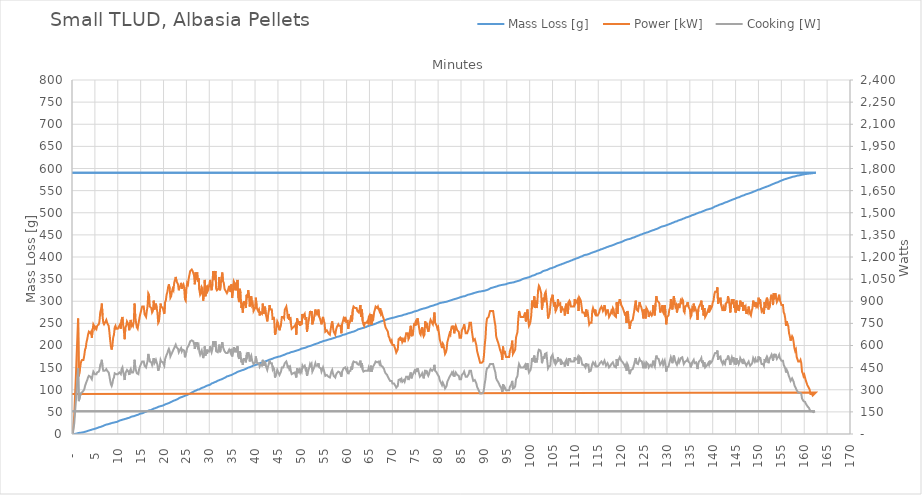
| Category | Mass Loss [g] |
|---|---|
| 0.1666666637174785 | 0 |
| 0.333333337912336 | 0 |
| 0.5000000016298145 | 0.1 |
| 0.666666665347293 | 0.3 |
| 0.849999999627471 | 0.6 |
| 1.000000003259629 | 1 |
| 1.1666666669771075 | 1.5 |
| 1.333333330694586 | 2.1 |
| 1.5000000048894435 | 2.4 |
| 1.666666668606922 | 2.7 |
| 1.8500000028871 | 2.8 |
| 2.0166666666045785 | 3.1 |
| 2.183333330322057 | 3.4 |
| 2.333333333954215 | 3.7 |
| 2.4999999976716936 | 4 |
| 2.6833333319518715 | 4.5 |
| 2.84999999566935 | 5 |
| 2.999999999301508 | 5.5 |
| 3.1666666630189866 | 6 |
| 3.333333337213844 | 6.5 |
| 3.5000000009313226 | 7.1 |
| 3.6833333352115005 | 7.7 |
| 3.849999998928979 | 8.4 |
| 4.000000002561137 | 8.6 |
| 4.166666666278616 | 9.3 |
| 4.333333329996094 | 9.8 |
| 4.500000004190952 | 10.4 |
| 4.66666666790843 | 10.9 |
| 4.833333331625909 | 11.4 |
| 4.999999995343387 | 11.8 |
| 5.166666669538245 | 12.4 |
| 5.350000003818423 | 12.5 |
| 5.499999996973202 | 13.5 |
| 5.666666671168059 | 14.5 |
| 5.849999994970858 | 15 |
| 5.999999998603016 | 15.5 |
| 6.166666662320495 | 15.8 |
| 6.333333336515352 | 16.4 |
| 6.51666667079553 | 17.1 |
| 6.666666663950309 | 17.7 |
| 6.833333338145167 | 18.3 |
| 7.000000001862645 | 19 |
| 7.166666665580124 | 20 |
| 7.349999999860302 | 20.8 |
| 7.50000000349246 | 21.3 |
| 7.683333337772638 | 21.5 |
| 7.833333330927417 | 22 |
| 8.016666665207595 | 22.4 |
| 8.166666668839753 | 23 |
| 8.35000000311993 | 23.4 |
| 8.49999999627471 | 24.1 |
| 8.666666670469567 | 24.6 |
| 8.833333334187046 | 25.1 |
| 8.999999997904524 | 25.6 |
| 9.166666661622003 | 25.9 |
| 9.33333333581686 | 26.3 |
| 9.499999999534339 | 26.7 |
| 9.683333333814517 | 27 |
| 9.833333337446675 | 27.5 |
| 10.000000001164153 | 28.5 |
| 10.166666664881632 | 29.1 |
| 10.33333332859911 | 30.2 |
| 10.500000002793968 | 30.7 |
| 10.666666666511446 | 31.2 |
| 10.833333330228925 | 31.7 |
| 11.016666664509103 | 32.2 |
| 11.16666666814126 | 32.7 |
| 11.33333333185874 | 33.2 |
| 11.499999995576218 | 33.7 |
| 11.666666669771075 | 33.8 |
| 11.850000004051253 | 34.7 |
| 12.016666667768732 | 35.4 |
| 12.18333333148621 | 35.9 |
| 12.333333335118368 | 36.1 |
| 12.516666669398546 | 36.6 |
| 12.666666662553325 | 37.9 |
| 12.833333336748183 | 38.5 |
| 13.000000000465661 | 39.3 |
| 13.16666666418314 | 39.7 |
| 13.333333338377997 | 40.1 |
| 13.500000002095476 | 40.2 |
| 13.666666665812954 | 41.2 |
| 13.833333329530433 | 41.5 |
| 14.00000000372529 | 42 |
| 14.166666667442769 | 42.8 |
| 14.350000001722947 | 43.2 |
| 14.500000005355105 | 43.7 |
| 14.666666669072583 | 45.4 |
| 14.850000003352761 | 45.8 |
| 14.99999999650754 | 46 |
| 15.166666670702398 | 46.5 |
| 15.333333334419876 | 46.8 |
| 15.499999998137355 | 47.2 |
| 15.683333332417533 | 47.9 |
| 15.849999996135011 | 49.2 |
| 15.99999999976717 | 49.7 |
| 16.183333334047347 | 50.4 |
| 16.349999997764826 | 51.4 |
| 16.500000001396984 | 51.8 |
| 16.666666665114462 | 52.3 |
| 16.83333332883194 | 53.5 |
| 17.0000000030268 | 53.8 |
| 17.166666666744277 | 53.9 |
| 17.333333330461755 | 54.8 |
| 17.500000004656613 | 55.4 |
| 17.66666666837409 | 56.7 |
| 17.85000000265427 | 57.3 |
| 17.99999999580905 | 57.8 |
| 18.183333330089226 | 58.3 |
| 18.333333333721384 | 58.9 |
| 18.499999997438863 | 59.6 |
| 18.66666667163372 | 60.1 |
| 18.8333333353512 | 61.3 |
| 18.999999999068677 | 61.9 |
| 19.166666662786156 | 62.4 |
| 19.349999997066334 | 62.7 |
| 19.500000000698492 | 63.3 |
| 19.68333333497867 | 63.6 |
| 19.84999999869615 | 64.2 |
| 20.000000002328306 | 64.9 |
| 20.166666666045785 | 65.9 |
| 20.350000000325963 | 67.1 |
| 20.50000000395812 | 67.5 |
| 20.6666666676756 | 68.2 |
| 20.850000001955777 | 68.6 |
| 20.999999995110556 | 69.6 |
| 21.166666669305414 | 70 |
| 21.350000003585592 | 71.3 |
| 21.49999999674037 | 71.7 |
| 21.66666667093523 | 72.7 |
| 21.833333334652707 | 73.2 |
| 21.999999998370185 | 74.1 |
| 22.166666662087664 | 75 |
| 22.33333333628252 | 75.7 |
| 22.5 | 76.3 |
| 22.66666666371748 | 76.8 |
| 22.849999997997656 | 77.8 |
| 23.000000001629815 | 78.4 |
| 23.166666665347293 | 79.3 |
| 23.33333332906477 | 80.2 |
| 23.50000000325963 | 81.7 |
| 23.683333337539807 | 82.3 |
| 23.833333330694586 | 83 |
| 24.000000004889444 | 83.5 |
| 24.166666668606922 | 84.2 |
| 24.3500000028871 | 84.7 |
| 24.49999999604188 | 85.6 |
| 24.683333330322057 | 86.3 |
| 24.850000004516914 | 87 |
| 24.999999997671694 | 87.6 |
| 25.16666667186655 | 88.4 |
| 25.34999999566935 | 89.4 |
| 25.499999999301508 | 90.1 |
| 25.666666663018987 | 90.8 |
| 25.833333337213844 | 91.3 |
| 26.000000000931323 | 92.8 |
| 26.1666666646488 | 93.7 |
| 26.34999999892898 | 94.3 |
| 26.500000002561137 | 95.2 |
| 26.666666666278616 | 96.1 |
| 26.833333329996094 | 97.3 |
| 27.00000000419095 | 98 |
| 27.18333333847113 | 98.7 |
| 27.350000002188608 | 99.4 |
| 27.499999995343387 | 100.4 |
| 27.666666669538245 | 100.8 |
| 27.850000003818423 | 100.9 |
| 27.9999999969732 | 102.2 |
| 28.16666667116806 | 103.2 |
| 28.349999994970858 | 104.6 |
| 28.499999998603016 | 104.6 |
| 28.666666662320495 | 105.7 |
| 28.849999996600673 | 105.8 |
| 29.00000000023283 | 106.7 |
| 29.16666666395031 | 107.5 |
| 29.333333338145167 | 108.6 |
| 29.500000001862645 | 109.2 |
| 29.666666665580124 | 109.4 |
| 29.833333329297602 | 110.3 |
| 30.00000000349246 | 111.3 |
| 30.183333337772638 | 111.5 |
| 30.333333330927417 | 113.2 |
| 30.500000005122274 | 114.1 |
| 30.683333328925073 | 114.5 |
| 30.85000000311993 | 115.5 |
| 30.99999999627471 | 115.6 |
| 31.183333330554888 | 117.1 |
| 31.350000004749745 | 117.5 |
| 31.499999997904524 | 118.3 |
| 31.666666661622003 | 119.3 |
| 31.84999999590218 | 120.4 |
| 31.99999999953434 | 120.7 |
| 32.16666666325182 | 121.7 |
| 32.349999997531995 | 122.5 |
| 32.50000000116415 | 123 |
| 32.68333333544433 | 123.8 |
| 32.83333332859911 | 124.2 |
| 33.00000000279397 | 125.3 |
| 33.166666666511446 | 126.2 |
| 33.333333330228925 | 126.8 |
| 33.50000000442378 | 127.6 |
| 33.66666666814126 | 128.4 |
| 33.85000000242144 | 130.2 |
| 33.99999999557622 | 130.7 |
| 34.166666669771075 | 130.9 |
| 34.35000000405125 | 131.5 |
| 34.49999999720603 | 132.3 |
| 34.66666667140089 | 132.6 |
| 34.83333333511837 | 133.3 |
| 34.99999999883585 | 133.8 |
| 35.166666662553325 | 135.1 |
| 35.3499999968335 | 136.2 |
| 35.50000000046566 | 136.8 |
| 35.68333333474584 | 137.2 |
| 35.84999999846332 | 138.5 |
| 36.000000002095476 | 139.4 |
| 36.166666665812954 | 140.4 |
| 36.33333332953043 | 141.2 |
| 36.50000000372529 | 141.7 |
| 36.66666666744277 | 142 |
| 36.83333333116025 | 142.8 |
| 37.000000005355105 | 143 |
| 37.183333329157904 | 144.2 |
| 37.33333333279006 | 144.3 |
| 37.49999999650754 | 145.1 |
| 37.68333333078772 | 146.6 |
| 37.850000004982576 | 146.7 |
| 37.999999998137355 | 147 |
| 38.16666666185483 | 148.2 |
| 38.34999999613501 | 148.6 |
| 38.49999999976717 | 150.1 |
| 38.68333333404735 | 150.6 |
| 38.833333337679505 | 150.9 |
| 39.000000001396984 | 151.3 |
| 39.16666666511446 | 152.4 |
| 39.34999999939464 | 153.4 |
| 39.5000000030268 | 154 |
| 39.66666666674428 | 154.4 |
| 39.833333330461755 | 155.2 |
| 40.00000000465661 | 155.8 |
| 40.16666666837409 | 156.3 |
| 40.35000000265427 | 156.9 |
| 40.49999999580905 | 157.4 |
| 40.666666670003906 | 158.4 |
| 40.850000004284084 | 158.9 |
| 40.99999999743886 | 159.4 |
| 41.16666667163372 | 160.5 |
| 41.34999999543652 | 161 |
| 41.49999999906868 | 161.8 |
| 41.683333333348855 | 162.3 |
| 41.849999997066334 | 162.8 |
| 42.00000000069849 | 163.2 |
| 42.16666666441597 | 164 |
| 42.34999999869615 | 164.5 |
| 42.500000002328306 | 165 |
| 42.666666666045785 | 166.2 |
| 42.83333332976326 | 166.5 |
| 43.00000000395812 | 167.2 |
| 43.1666666676756 | 168 |
| 43.33333333139308 | 168.6 |
| 43.49999999511056 | 169.1 |
| 43.666666669305414 | 169.4 |
| 43.85000000358559 | 170.3 |
| 43.99999999674037 | 171.1 |
| 44.18333333102055 | 171.9 |
| 44.350000005215406 | 172.4 |
| 44.499999998370185 | 172.9 |
| 44.666666662087664 | 173.4 |
| 44.84999999636784 | 173.9 |
| 45.0 | 174.4 |
| 45.16666666371748 | 174.9 |
| 45.333333337912336 | 174.7 |
| 45.500000001629815 | 175.4 |
| 45.66666666534729 | 176.3 |
| 45.84999999962747 | 177 |
| 46.00000000325963 | 177.8 |
| 46.16666666697711 | 178.3 |
| 46.350000001257285 | 178.9 |
| 46.50000000488944 | 179.4 |
| 46.68333332869224 | 180.3 |
| 46.8333333323244 | 181.3 |
| 46.99999999604188 | 181.8 |
| 47.16666667023674 | 182.3 |
| 47.350000004516914 | 182.7 |
| 47.499999997671694 | 183.1 |
| 47.68333333195187 | 183.9 |
| 47.84999999566935 | 184.9 |
| 47.99999999930151 | 185.3 |
| 48.16666666301899 | 185.6 |
| 48.333333337213844 | 186.4 |
| 48.50000000093132 | 186.6 |
| 48.6833333352115 | 187.3 |
| 48.84999999892898 | 187.7 |
| 49.01666666264646 | 188.4 |
| 49.183333336841315 | 188.9 |
| 49.35000000055879 | 189.5 |
| 49.51666666427627 | 189.9 |
| 49.68333333847113 | 190.4 |
| 49.85000000218861 | 191.3 |
| 50.01666666590609 | 191.6 |
| 50.183333329623565 | 193.1 |
| 50.35000000381842 | 193.4 |
| 50.5166666675359 | 193.8 |
| 50.68333333125338 | 194.2 |
| 50.84999999497086 | 194.6 |
| 51.016666669165716 | 195.3 |
| 51.183333332883194 | 195.8 |
| 51.34999999660067 | 197 |
| 51.51666667079553 | 197.4 |
| 51.68333333451301 | 197.8 |
| 51.84999999823049 | 198.5 |
| 52.016666661947966 | 199 |
| 52.18333333614282 | 199.5 |
| 52.3499999998603 | 200 |
| 52.51666666357778 | 200.7 |
| 52.68333333777264 | 201.4 |
| 52.850000001490116 | 202.1 |
| 53.016666665207595 | 202.9 |
| 53.18333332892507 | 203.4 |
| 53.35000000311993 | 204.1 |
| 53.51666666683741 | 204.4 |
| 53.68333333055489 | 204.8 |
| 53.850000004749745 | 205.6 |
| 54.016666668467224 | 206.3 |
| 54.1833333321847 | 207.4 |
| 54.34999999590218 | 207.6 |
| 54.51666667009704 | 208.2 |
| 54.68333333381452 | 208.8 |
| 54.849999997531995 | 209.8 |
| 55.01666667172685 | 210 |
| 55.18333333544433 | 210.7 |
| 55.34999999916181 | 211.2 |
| 55.51666666287929 | 211.5 |
| 55.683333337074146 | 211.8 |
| 55.850000000791624 | 212.7 |
| 56.0166666645091 | 213.2 |
| 56.18333333870396 | 213.8 |
| 56.35000000242144 | 214.3 |
| 56.51666666613892 | 214.5 |
| 56.683333329856396 | 215.2 |
| 56.85000000405125 | 215.7 |
| 57.01666666776873 | 216.6 |
| 57.18333333148621 | 216.8 |
| 57.34999999520369 | 217.4 |
| 57.516666669398546 | 217.9 |
| 57.683333333116025 | 218.9 |
| 57.8499999968335 | 219.4 |
| 58.01666667102836 | 219.9 |
| 58.18333333474584 | 220.1 |
| 58.34999999846332 | 220.7 |
| 58.516666662180796 | 221 |
| 58.683333336375654 | 221.5 |
| 58.85000000009313 | 222.4 |
| 59.01666666381061 | 222.9 |
| 59.18333333800547 | 224 |
| 59.35000000172295 | 224.1 |
| 59.516666665440425 | 224.7 |
| 59.683333329157904 | 225.2 |
| 59.85000000335276 | 225.7 |
| 60.01666666707024 | 226.8 |
| 60.18333333078772 | 227.3 |
| 60.350000004982576 | 227.9 |
| 60.516666668700054 | 228.4 |
| 60.68333333241753 | 228.9 |
| 60.84999999613501 | 229.4 |
| 61.01666667032987 | 229.9 |
| 61.18333333404735 | 230.6 |
| 61.349999997764826 | 231.1 |
| 61.51666667195968 | 231.5 |
| 61.68333333567716 | 232.2 |
| 61.84999999939464 | 232.7 |
| 62.01666666311212 | 233.7 |
| 62.183333337306976 | 234.4 |
| 62.350000001024455 | 235.7 |
| 62.51666666474193 | 236.5 |
| 62.68333332845941 | 237 |
| 62.85000000265427 | 237.4 |
| 63.01666666637175 | 237.9 |
| 63.183333330089226 | 238.4 |
| 63.350000004284084 | 238.9 |
| 63.51666666800156 | 239.4 |
| 63.68333333171904 | 239.7 |
| 63.84999999543652 | 240.4 |
| 64.01666666963138 | 241.4 |
| 64.18333333334886 | 241.6 |
| 64.34999999706633 | 242.8 |
| 64.51666667126119 | 243.3 |
| 64.68333333497867 | 243.9 |
| 64.84999999869615 | 244.3 |
| 65.01666666241363 | 244.9 |
| 65.18333333660848 | 245.4 |
| 65.35000000032596 | 245.9 |
| 65.51666666404344 | 246.5 |
| 65.6833333382383 | 246.9 |
| 65.85000000195578 | 247.6 |
| 66.01666666567326 | 248.4 |
| 66.18333332939073 | 248.8 |
| 66.35000000358559 | 249.7 |
| 66.51666666730307 | 250.2 |
| 66.68333333102055 | 251.2 |
| 66.8500000052154 | 251.7 |
| 67.01666666893288 | 252.5 |
| 67.18333333265036 | 253.3 |
| 67.34999999636784 | 254 |
| 67.5166666705627 | 254.5 |
| 67.68333333428018 | 255 |
| 67.84999999799766 | 255.5 |
| 68.01666666171513 | 256.2 |
| 68.18333333590999 | 256.7 |
| 68.34999999962747 | 257.3 |
| 68.51666666334495 | 257.8 |
| 68.6833333375398 | 258.4 |
| 68.85000000125729 | 259.2 |
| 69.01666666497476 | 259.7 |
| 69.18333332869224 | 260.2 |
| 69.3500000028871 | 260.7 |
| 69.51666666660458 | 261.2 |
| 69.68333333032206 | 261.6 |
| 69.85000000451691 | 262 |
| 70.0166666682344 | 262.4 |
| 70.18333333195187 | 262.8 |
| 70.34999999566935 | 263.2 |
| 70.51666666986421 | 263.6 |
| 70.68333333358169 | 264 |
| 70.84999999729916 | 264.7 |
| 71.01666667149402 | 265.2 |
| 71.1833333352115 | 265.7 |
| 71.34999999892898 | 266.2 |
| 71.51666666264646 | 266.7 |
| 71.68333333684132 | 266.9 |
| 71.8500000005588 | 267.1 |
| 72.01666666427627 | 267.6 |
| 72.18333333847113 | 268.1 |
| 72.35000000218861 | 269.2 |
| 72.51666666590609 | 269.6 |
| 72.68333332962357 | 270.1 |
| 72.85000000381842 | 270.3 |
| 73.0166666675359 | 271.2 |
| 73.18333333125338 | 271.4 |
| 73.34999999497086 | 272 |
| 73.51666666916572 | 272.6 |
| 73.6833333328832 | 272.9 |
| 73.84999999660067 | 273.4 |
| 74.01666667079553 | 273.9 |
| 74.18333333451301 | 274.4 |
| 74.34999999823049 | 274.9 |
| 74.51666666194797 | 275.6 |
| 74.68333333614282 | 276.1 |
| 74.8499999998603 | 277.1 |
| 75.01666666357778 | 277.6 |
| 75.18333333777264 | 277.8 |
| 75.35000000149012 | 278.3 |
| 75.5166666652076 | 278.8 |
| 75.68333332892507 | 279.9 |
| 75.85000000311993 | 280.4 |
| 76.01666666683741 | 280.7 |
| 76.18333333055489 | 281.6 |
| 76.35000000474975 | 281.8 |
| 76.51666666846722 | 282.7 |
| 76.6833333321847 | 283.1 |
| 76.84999999590218 | 283.6 |
| 77.01666667009704 | 283.9 |
| 77.18333333381452 | 284.3 |
| 77.349999997532 | 284.8 |
| 77.51666667172685 | 285.5 |
| 77.68333333544433 | 286 |
| 77.84999999916181 | 286.5 |
| 78.01666666287929 | 287.1 |
| 78.18333333707415 | 288.3 |
| 78.35000000079162 | 288.8 |
| 78.5166666645091 | 289.3 |
| 78.68333333870396 | 289.8 |
| 78.85000000242144 | 290 |
| 79.01666666613892 | 290.7 |
| 79.1833333298564 | 291.4 |
| 79.35000000405125 | 292 |
| 79.51666666776873 | 292.5 |
| 79.68333333148621 | 293 |
| 79.84999999520369 | 293.4 |
| 80.01666666939855 | 294.2 |
| 80.18333333311602 | 295.3 |
| 80.3499999968335 | 295.8 |
| 80.51666667102836 | 296.3 |
| 80.68333333474584 | 296.6 |
| 80.84999999846332 | 296.9 |
| 81.0166666621808 | 297.2 |
| 81.18333333637565 | 297.5 |
| 81.35000000009313 | 297.8 |
| 81.51666666381061 | 298.4 |
| 81.68333333800547 | 298.5 |
| 81.85000000172295 | 298.8 |
| 82.01666666544043 | 299.5 |
| 82.1833333291579 | 300.2 |
| 82.35000000335276 | 301 |
| 82.51666666707024 | 301.2 |
| 82.68333333078772 | 301.8 |
| 82.85000000498258 | 302.3 |
| 83.01666666870005 | 303.1 |
| 83.18333333241753 | 303.6 |
| 83.34999999613501 | 304.1 |
| 83.51666667032987 | 304.6 |
| 83.68333333404735 | 305.1 |
| 83.84999999776483 | 305.6 |
| 84.01666667195968 | 306.1 |
| 84.18333333567716 | 306.6 |
| 84.34999999939464 | 307.5 |
| 84.51666666311212 | 307.8 |
| 84.68333333730698 | 308.3 |
| 84.85000000102445 | 309.1 |
| 85.01666666474193 | 309.6 |
| 85.18333332845941 | 310.1 |
| 85.35000000265427 | 310.6 |
| 85.51666666637175 | 311 |
| 85.68333333008923 | 311.1 |
| 85.85000000428408 | 311.6 |
| 86.01666666800156 | 312.1 |
| 86.18333333171904 | 313.1 |
| 86.34999999543652 | 313.6 |
| 86.51666666963138 | 314.7 |
| 86.68333333334886 | 315.2 |
| 86.84999999706633 | 315.4 |
| 87.01666667126119 | 315.9 |
| 87.18333333497867 | 316.4 |
| 87.34999999869615 | 316.9 |
| 87.51666666241363 | 317.4 |
| 87.68333333660848 | 318.1 |
| 87.85000000032596 | 318.6 |
| 88.01666666404344 | 319.1 |
| 88.1833333382383 | 319.6 |
| 88.35000000195578 | 320.1 |
| 88.51666666567326 | 320.6 |
| 88.68333332939073 | 321 |
| 88.85000000358559 | 321.5 |
| 89.01666666730307 | 321.8 |
| 89.18333333102055 | 322.1 |
| 89.3500000052154 | 322.4 |
| 89.51666666893288 | 322.5 |
| 89.68333333265036 | 322.8 |
| 89.84999999636784 | 323.3 |
| 90.0166666705627 | 323.6 |
| 90.18333333428018 | 323.9 |
| 90.34999999799766 | 324.4 |
| 90.51666666171513 | 324.9 |
| 90.68333333590999 | 325.4 |
| 90.84999999962747 | 325.9 |
| 91.01666666334495 | 326.8 |
| 91.1833333375398 | 327.8 |
| 91.35000000125729 | 328.6 |
| 91.51666666497476 | 329.8 |
| 91.68333332869224 | 330.3 |
| 91.8500000028871 | 330.6 |
| 92.01666666660458 | 331.2 |
| 92.18333333032206 | 331.7 |
| 92.35000000451691 | 332.2 |
| 92.5166666682344 | 332.7 |
| 92.68333333195187 | 333.2 |
| 92.84999999566935 | 333.7 |
| 93.01666666986421 | 334.2 |
| 93.18333333358169 | 335.1 |
| 93.34999999729916 | 335.4 |
| 93.51666667149402 | 335.9 |
| 93.6833333352115 | 336.4 |
| 93.84999999892898 | 336.7 |
| 94.01666666264646 | 337 |
| 94.18333333684132 | 337.3 |
| 94.3500000005588 | 337.6 |
| 94.51666666427627 | 337.9 |
| 94.68333333847113 | 338.4 |
| 94.85000000218861 | 338.6 |
| 95.01666666590609 | 338.7 |
| 95.18333332962357 | 340.1 |
| 95.35000000381842 | 340.5 |
| 95.5166666675359 | 341 |
| 95.68333333125338 | 341.3 |
| 95.84999999497086 | 341.6 |
| 96.01666666916572 | 341.9 |
| 96.1833333328832 | 342.2 |
| 96.34999999660067 | 342.5 |
| 96.51666667079553 | 342.8 |
| 96.68333333451301 | 343.5 |
| 96.84999999823049 | 344 |
| 97.01666666194797 | 344.5 |
| 97.18333333614282 | 345 |
| 97.3499999998603 | 345.5 |
| 97.51666666357778 | 346 |
| 97.68333333777264 | 346.5 |
| 97.85000000149012 | 347 |
| 98.0166666652076 | 348.1 |
| 98.18333332892507 | 348.6 |
| 98.35000000311993 | 349.1 |
| 98.51666666683741 | 350.3 |
| 98.68333333055489 | 351.1 |
| 98.85000000474975 | 351.6 |
| 99.01666666846722 | 351.9 |
| 99.1833333321847 | 352.4 |
| 99.34999999590218 | 352.9 |
| 99.51666667009704 | 353.4 |
| 99.68333333381452 | 353.9 |
| 99.849999997532 | 354.4 |
| 100.01666667172685 | 355.2 |
| 100.18333333544433 | 355.7 |
| 100.34999999916181 | 356.6 |
| 100.51666666287929 | 357.5 |
| 100.68333333707415 | 358 |
| 100.85000000079162 | 358.4 |
| 101.0166666645091 | 359 |
| 101.18333333870396 | 359.5 |
| 101.35000000242144 | 360.4 |
| 101.51666666613892 | 361.9 |
| 101.6833333298564 | 362 |
| 101.85000000405125 | 362.6 |
| 102.01666666776873 | 363.7 |
| 102.18333333148621 | 363.7 |
| 102.34999999520369 | 364.7 |
| 102.51666666939855 | 365.1 |
| 102.68333333311602 | 366.4 |
| 102.8499999968335 | 367.7 |
| 103.01666667102836 | 368.4 |
| 103.18333333474584 | 368.9 |
| 103.34999999846332 | 369.4 |
| 103.5166666621808 | 369.9 |
| 103.68333333637565 | 370.3 |
| 103.85000000009313 | 370.8 |
| 104.01666666381061 | 371.8 |
| 104.18333333800547 | 372.6 |
| 104.35000000172295 | 373.2 |
| 104.51666666544043 | 374.3 |
| 104.6833333291579 | 374.7 |
| 104.85000000335276 | 375 |
| 105.01666666707024 | 375.5 |
| 105.18333333078772 | 376.4 |
| 105.35000000498258 | 377 |
| 105.51666666870005 | 377.5 |
| 105.68333333241753 | 379 |
| 105.84999999613501 | 379.5 |
| 106.01666667032987 | 380.2 |
| 106.18333333404735 | 380.7 |
| 106.34999999776483 | 381.2 |
| 106.51666667195968 | 382.1 |
| 106.68333333567716 | 382.6 |
| 106.84999999939464 | 383.1 |
| 107.01666666311212 | 383.6 |
| 107.18333333730698 | 384.6 |
| 107.35000000102445 | 385.1 |
| 107.51666666474193 | 385.7 |
| 107.68333332845941 | 386.3 |
| 107.85000000265427 | 387.2 |
| 108.01666666637175 | 388.1 |
| 108.18333333008923 | 388.6 |
| 108.35000000428408 | 389.1 |
| 108.51666666800156 | 389.6 |
| 108.68333333171904 | 390.1 |
| 108.84999999543652 | 391.2 |
| 109.01666666963138 | 391.9 |
| 109.18333333334886 | 392.4 |
| 109.34999999706633 | 392.7 |
| 109.51666667126119 | 394 |
| 109.68333333497867 | 394.7 |
| 109.84999999869615 | 395.2 |
| 110.01666666241363 | 395.8 |
| 110.18333333660848 | 396.7 |
| 110.35000000032596 | 397.2 |
| 110.51666666404344 | 397.7 |
| 110.6833333382383 | 398.2 |
| 110.85000000195578 | 399.2 |
| 111.01666666567326 | 400 |
| 111.18333332939073 | 400.8 |
| 111.35000000358559 | 401.3 |
| 111.51666666730307 | 401.8 |
| 111.68333333102055 | 402.3 |
| 111.8500000052154 | 403.9 |
| 112.01666666893288 | 404.3 |
| 112.18333333265036 | 404.8 |
| 112.34999999636784 | 405.3 |
| 112.5166666705627 | 405.4 |
| 112.68333333428018 | 405.9 |
| 112.84999999799766 | 406.4 |
| 113.01666666171513 | 407.3 |
| 113.18333333590999 | 407.9 |
| 113.34999999962747 | 409.2 |
| 113.51666666334495 | 409.4 |
| 113.6833333375398 | 410 |
| 113.85000000125729 | 410.5 |
| 114.01666666497476 | 411.3 |
| 114.18333332869224 | 411.8 |
| 114.3500000028871 | 412.3 |
| 114.51666666660458 | 412.8 |
| 114.68333333032206 | 413.7 |
| 114.85000000451691 | 414.4 |
| 115.0166666682344 | 414.9 |
| 115.18333333195187 | 415.5 |
| 115.34999999566935 | 416.3 |
| 115.51666666986421 | 417.2 |
| 115.68333333358169 | 417.4 |
| 115.84999999729916 | 418 |
| 116.01666667149402 | 418.6 |
| 116.1833333352115 | 419.5 |
| 116.34999999892898 | 420.2 |
| 116.51666666264646 | 420.7 |
| 116.68333333684132 | 421.4 |
| 116.8500000005588 | 422.2 |
| 117.01666666427627 | 422.7 |
| 117.18333333847113 | 423.3 |
| 117.35000000218861 | 424.2 |
| 117.51666666590609 | 424.7 |
| 117.68333332962357 | 425.3 |
| 117.85000000381842 | 425.6 |
| 118.0166666675359 | 426.4 |
| 118.18333333125338 | 426.8 |
| 118.34999999497086 | 427.4 |
| 118.51666666916572 | 428.2 |
| 118.6833333328832 | 428.8 |
| 118.84999999660067 | 429.7 |
| 119.01666667079553 | 430.4 |
| 119.18333333451301 | 431.2 |
| 119.34999999823049 | 431.7 |
| 119.51666666194797 | 432.2 |
| 119.68333333614282 | 432.7 |
| 119.8499999998603 | 433.2 |
| 120.01666666357778 | 434.5 |
| 120.18333333777264 | 434.5 |
| 120.35000000149012 | 435.5 |
| 120.5166666652076 | 436.1 |
| 120.68333332892507 | 437.3 |
| 120.85000000311993 | 437.9 |
| 121.01666666683741 | 438.4 |
| 121.18333333055489 | 439 |
| 121.35000000474975 | 439.7 |
| 121.51666666846722 | 440.2 |
| 121.6833333321847 | 440.4 |
| 121.84999999590218 | 440.7 |
| 122.01666667009704 | 441.4 |
| 122.18333333381452 | 442 |
| 122.349999997532 | 442.8 |
| 122.51666667172685 | 443.6 |
| 122.68333333544433 | 444.2 |
| 122.84999999916181 | 444.4 |
| 123.01666666287929 | 445.3 |
| 123.18333333707415 | 446 |
| 123.35000000079162 | 446.6 |
| 123.5166666645091 | 447.4 |
| 123.68333333870396 | 448.2 |
| 123.85000000242144 | 448.7 |
| 124.01666666613892 | 449.4 |
| 124.1833333298564 | 450.4 |
| 124.35000000405125 | 450.4 |
| 124.51666666776873 | 451.2 |
| 124.68333333148621 | 451.9 |
| 124.84999999520369 | 452.8 |
| 125.01666666939855 | 453.3 |
| 125.18333333311602 | 454 |
| 125.3499999968335 | 454.6 |
| 125.51666667102836 | 455.2 |
| 125.68333333474584 | 455.6 |
| 125.84999999846332 | 456 |
| 126.0166666621808 | 457.1 |
| 126.18333333637565 | 457.6 |
| 126.35000000009313 | 458.2 |
| 126.51666666381061 | 458.9 |
| 126.68333333800547 | 459.7 |
| 126.85000000172295 | 460.2 |
| 127.01666666544043 | 460.7 |
| 127.1833333291579 | 461.2 |
| 127.35000000335276 | 462.2 |
| 127.51666666707024 | 462.7 |
| 127.68333333078772 | 463.2 |
| 127.85000000498258 | 463.7 |
| 128.01666666870005 | 464.7 |
| 128.18333333241753 | 465.3 |
| 128.349999996135 | 465.6 |
| 128.51666667032987 | 467 |
| 128.68333333404735 | 468.2 |
| 128.84999999776483 | 468.7 |
| 129.01666667195968 | 469.2 |
| 129.18333333567716 | 469.6 |
| 129.34999999939464 | 470 |
| 129.51666666311212 | 470.4 |
| 129.68333333730698 | 470.9 |
| 129.85000000102445 | 471.7 |
| 130.01666666474193 | 472.4 |
| 130.1833333284594 | 472.9 |
| 130.35000000265427 | 473.4 |
| 130.51666666637175 | 474.3 |
| 130.68333333008923 | 475.2 |
| 130.85000000428408 | 475.6 |
| 131.01666666800156 | 476.6 |
| 131.18333333171904 | 477.1 |
| 131.34999999543652 | 477.6 |
| 131.51666666963138 | 478.4 |
| 131.68333333334886 | 478.9 |
| 131.84999999706633 | 480 |
| 132.0166666712612 | 480.5 |
| 132.18333333497867 | 480.8 |
| 132.34999999869615 | 481.3 |
| 132.51666666241363 | 482.7 |
| 132.68333333660848 | 483.2 |
| 132.85000000032596 | 483.8 |
| 133.01666666404344 | 484.3 |
| 133.1833333382383 | 484.8 |
| 133.35000000195578 | 485.6 |
| 133.51666666567326 | 486.4 |
| 133.68333332939073 | 486.9 |
| 133.8500000035856 | 487.6 |
| 134.01666666730307 | 489 |
| 134.18333333102055 | 489.4 |
| 134.3500000052154 | 489.9 |
| 134.51666666893288 | 490.3 |
| 134.68333333265036 | 491 |
| 134.84999999636784 | 491.4 |
| 135.0166666705627 | 492.4 |
| 135.18333333428018 | 492.9 |
| 135.34999999799766 | 493.5 |
| 135.51666666171513 | 494.5 |
| 135.68333333591 | 495 |
| 135.84999999962747 | 495.5 |
| 136.01666666334495 | 496 |
| 136.1833333375398 | 496.9 |
| 136.35000000125729 | 497.4 |
| 136.51666666497476 | 498.4 |
| 136.68333332869224 | 498.7 |
| 136.8500000028871 | 499.8 |
| 137.01666666660458 | 499.8 |
| 137.18333333032206 | 500.9 |
| 137.35000000451691 | 501.4 |
| 137.5166666682344 | 501.7 |
| 137.68333333195187 | 502.2 |
| 137.84999999566935 | 503.4 |
| 138.0166666698642 | 504.1 |
| 138.1833333335817 | 504.7 |
| 138.34999999729916 | 505.7 |
| 138.51666667149402 | 506.4 |
| 138.6833333352115 | 506.8 |
| 138.84999999892898 | 507.4 |
| 139.01666666264646 | 507.8 |
| 139.18333333684132 | 508.3 |
| 139.3500000005588 | 508.8 |
| 139.51666666427627 | 509.3 |
| 139.68333333847113 | 509.8 |
| 139.8500000021886 | 510.3 |
| 140.0166666659061 | 511.8 |
| 140.18333332962357 | 512.3 |
| 140.35000000381842 | 513.4 |
| 140.5166666675359 | 514.1 |
| 140.68333333125338 | 514.9 |
| 140.84999999497086 | 515.4 |
| 141.01666666916572 | 516.3 |
| 141.1833333328832 | 516.8 |
| 141.34999999660067 | 517.7 |
| 141.51666667079553 | 518.4 |
| 141.683333334513 | 518.9 |
| 141.8499999982305 | 519.4 |
| 142.01666666194797 | 520.2 |
| 142.18333333614282 | 520.6 |
| 142.3499999998603 | 521.4 |
| 142.51666666357778 | 522.4 |
| 142.68333333777264 | 523.3 |
| 142.85000000149012 | 523.6 |
| 143.0166666652076 | 524.1 |
| 143.18333332892507 | 524.6 |
| 143.35000000311993 | 525.4 |
| 143.5166666668374 | 526.2 |
| 143.6833333305549 | 526.7 |
| 143.85000000474975 | 527.7 |
| 144.01666666846722 | 528.2 |
| 144.1833333321847 | 529.1 |
| 144.34999999590218 | 529.9 |
| 144.51666667009704 | 530.4 |
| 144.68333333381452 | 531.1 |
| 144.849999997532 | 531.5 |
| 145.01666667172685 | 532.4 |
| 145.18333333544433 | 533.2 |
| 145.3499999991618 | 533.4 |
| 145.5166666628793 | 534.5 |
| 145.68333333707415 | 534.7 |
| 145.85000000079162 | 535.4 |
| 146.0166666645091 | 535.9 |
| 146.18333333870396 | 537.2 |
| 146.35000000242144 | 537.5 |
| 146.51666666613892 | 538.6 |
| 146.6833333298564 | 538.7 |
| 146.85000000405125 | 539.6 |
| 147.01666666776873 | 540.5 |
| 147.1833333314862 | 541.4 |
| 147.3499999952037 | 541.8 |
| 147.51666666939855 | 542.3 |
| 147.68333333311602 | 542.8 |
| 147.8499999968335 | 543.4 |
| 148.01666667102836 | 543.9 |
| 148.18333333474584 | 544.5 |
| 148.34999999846332 | 545.3 |
| 148.5166666621808 | 545.8 |
| 148.68333333637565 | 546.8 |
| 148.85000000009313 | 547.3 |
| 149.0166666638106 | 547.9 |
| 149.18333333800547 | 548.6 |
| 149.35000000172295 | 549.4 |
| 149.51666666544043 | 550.1 |
| 149.6833333291579 | 550.8 |
| 149.85000000335276 | 551.8 |
| 150.01666666707024 | 552.4 |
| 150.18333333078772 | 552.5 |
| 150.35000000498258 | 553.4 |
| 150.51666666870005 | 553.9 |
| 150.68333333241753 | 554.5 |
| 150.849999996135 | 555.4 |
| 151.01666667032987 | 556.5 |
| 151.18333333404735 | 556.7 |
| 151.34999999776483 | 557.7 |
| 151.51666667195968 | 558 |
| 151.68333333567716 | 558.4 |
| 151.84999999939464 | 559.2 |
| 152.01666666311212 | 560.1 |
| 152.18333333730698 | 560.5 |
| 152.35000000102445 | 561.4 |
| 152.51666666474193 | 561.9 |
| 152.6833333284594 | 562.9 |
| 152.85000000265427 | 563.7 |
| 153.01666666637175 | 564.4 |
| 153.18333333008923 | 564.9 |
| 153.35000000428408 | 565.5 |
| 153.51666666800156 | 566.4 |
| 153.68333333171904 | 567.2 |
| 153.84999999543652 | 567.8 |
| 154.01666666963138 | 568.3 |
| 154.18333333334886 | 568.8 |
| 154.34999999706633 | 570 |
| 154.5166666712612 | 570.5 |
| 154.68333333497867 | 571.4 |
| 154.84999999869615 | 572.1 |
| 155.01666666241363 | 572.6 |
| 155.18333333660848 | 573.4 |
| 155.35000000032596 | 574.1 |
| 155.51666666404344 | 574.9 |
| 155.6833333382383 | 575.4 |
| 155.85000000195578 | 576.1 |
| 156.01666666567326 | 576.5 |
| 156.18333332939073 | 577 |
| 156.3500000035856 | 577.5 |
| 156.51666666730307 | 578.2 |
| 156.68333333102055 | 578.6 |
| 156.8500000052154 | 579.2 |
| 157.01666666893288 | 579.4 |
| 157.18333333265036 | 580.2 |
| 157.34999999636784 | 580.8 |
| 157.5166666705627 | 581.4 |
| 157.68333333428018 | 581.7 |
| 157.84999999799766 | 582 |
| 158.01666666171513 | 582.4 |
| 158.18333333591 | 582.8 |
| 158.34999999962747 | 583.6 |
| 158.51666666334495 | 584 |
| 158.6833333375398 | 584.4 |
| 158.85000000125729 | 584.4 |
| 159.01666666497476 | 584.8 |
| 159.18333332869224 | 585.1 |
| 159.3500000028871 | 585.4 |
| 159.51666666660458 | 586 |
| 159.68333333032206 | 586.3 |
| 159.85000000451691 | 586.6 |
| 160.0166666682344 | 586.9 |
| 160.18333333195187 | 587.4 |
| 160.34999999566935 | 587.6 |
| 160.5166666698642 | 587.8 |
| 160.6833333335817 | 588.1 |
| 160.84999999729916 | 588.3 |
| 161.01666667149402 | 588.4 |
| 161.1833333352115 | 588.6 |
| 161.34999999892898 | 588.7 |
| 161.51666666264646 | 589 |
| 161.68333333684132 | 589.3 |
| 161.8500000005588 | 589.5 |
| 162.01666666427627 | 589.7 |
| 162.18333333847113 | 589.9 |
| 162.3500000021886 | 590.1 |
| 162.5166666659061 | 590.3 |